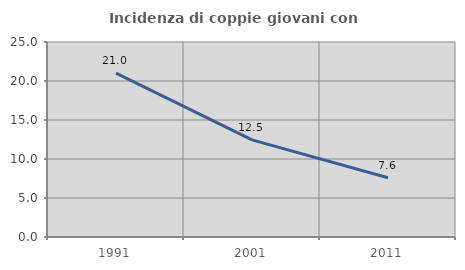
| Category | Incidenza di coppie giovani con figli |
|---|---|
| 1991.0 | 21 |
| 2001.0 | 12.453 |
| 2011.0 | 7.605 |